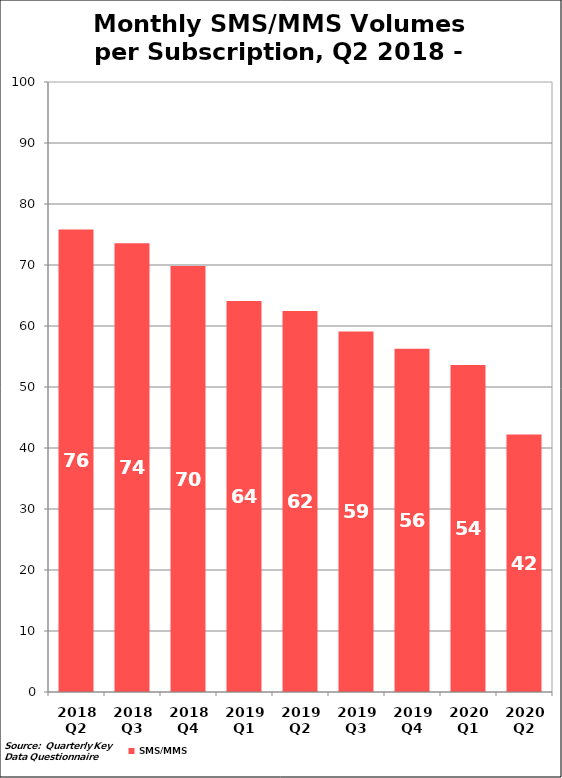
| Category | SMS/MMS |
|---|---|
| 2018 Q2 | 75.82 |
| 2018 Q3 | 73.568 |
| 2018 Q4 | 69.819 |
| 2019 Q1 | 64.105 |
| 2019 Q2 | 62.476 |
| 2019 Q3 | 59.093 |
| 2019 Q4 | 56.26 |
| 2020 Q1 | 53.592 |
| 2020 Q2 | 42.194 |